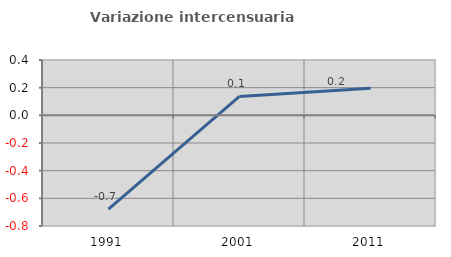
| Category | Variazione intercensuaria annua |
|---|---|
| 1991.0 | -0.679 |
| 2001.0 | 0.137 |
| 2011.0 | 0.196 |